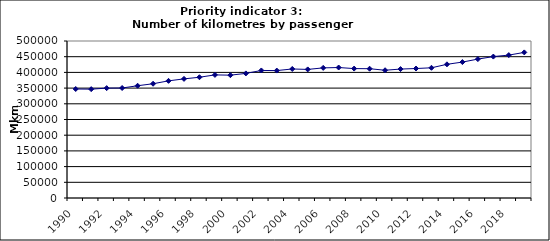
| Category | Number of kilometres by passenger cars, Mkm |
|---|---|
| 1990 | 347121.52 |
| 1991 | 346663.773 |
| 1992 | 349874.831 |
| 1993 | 350271.132 |
| 1994 | 357496.814 |
| 1995 | 363891.087 |
| 1996 | 373090.262 |
| 1997 | 379361.786 |
| 1998 | 384558.439 |
| 1999 | 392061.376 |
| 2000 | 391196.253 |
| 2001 | 396782.462 |
| 2002 | 406184.649 |
| 2003 | 405846.693 |
| 2004 | 410881.608 |
| 2005 | 409491.17 |
| 2006 | 414364.047 |
| 2007 | 415549.977 |
| 2008 | 412136.52 |
| 2009 | 411731.416 |
| 2010 | 406858.929 |
| 2011 | 410594.505 |
| 2012 | 412369.905 |
| 2013 | 414685.015 |
| 2014 | 425719.601 |
| 2015 | 432853.911 |
| 2016 | 442366.014 |
| 2017 | 450368.178 |
| 2018 | 455078.038 |
| 2019 | 463693.974 |